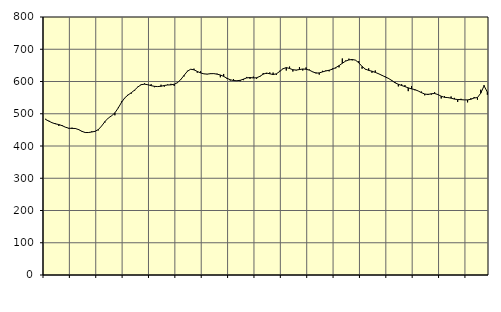
| Category | Piggar | Series 1 |
|---|---|---|
| nan | 484.3 | 482.21 |
| 87.0 | 478.1 | 477 |
| 87.0 | 471.3 | 471.91 |
| 87.0 | 470.2 | 468.63 |
| nan | 462.1 | 466.55 |
| 88.0 | 465.1 | 463.04 |
| 88.0 | 458 | 458.35 |
| 88.0 | 453.9 | 455.1 |
| nan | 456.8 | 454.6 |
| 89.0 | 455.7 | 454.3 |
| 89.0 | 452.7 | 450.87 |
| 89.0 | 444.4 | 445.42 |
| nan | 440.9 | 441.78 |
| 90.0 | 442.4 | 441.8 |
| 90.0 | 445.5 | 443.42 |
| 90.0 | 444.5 | 445.49 |
| nan | 448.5 | 451.05 |
| 91.0 | 462.4 | 462.18 |
| 91.0 | 473 | 475.91 |
| 91.0 | 486.8 | 486.66 |
| nan | 493.2 | 493.52 |
| 92.0 | 495.2 | 502.69 |
| 92.0 | 518.6 | 517.6 |
| 92.0 | 538 | 535.07 |
| nan | 548.4 | 549.22 |
| 93.0 | 559 | 558.13 |
| 93.0 | 562.6 | 565.29 |
| 93.0 | 571.8 | 573.62 |
| nan | 584.2 | 583.26 |
| 94.0 | 592 | 590.13 |
| 94.0 | 594.1 | 591.77 |
| 94.0 | 589.4 | 589.97 |
| nan | 591.7 | 587.15 |
| 95.0 | 582.3 | 585 |
| 95.0 | 584.1 | 584.28 |
| 95.0 | 590 | 585.3 |
| nan | 584.1 | 587.66 |
| 96.0 | 590.7 | 589.14 |
| 96.0 | 592.8 | 589.65 |
| 96.0 | 586.2 | 591.55 |
| nan | 597.4 | 596.36 |
| 97.0 | 605 | 606.16 |
| 97.0 | 615.8 | 619.02 |
| 97.0 | 633.2 | 631.64 |
| nan | 638.4 | 638.04 |
| 98.0 | 639.8 | 636.21 |
| 98.0 | 627.3 | 631.21 |
| 98.0 | 631.7 | 626.67 |
| nan | 623.3 | 623.71 |
| 99.0 | 622.2 | 622.95 |
| 99.0 | 625.4 | 624.21 |
| 99.0 | 623.8 | 624.46 |
| nan | 624.3 | 622.75 |
| 0.0 | 613.1 | 620.24 |
| 0.0 | 623.4 | 615.93 |
| 0.0 | 608.1 | 610.12 |
| nan | 603.1 | 605.36 |
| 1.0 | 607.3 | 603.04 |
| 1.0 | 601.8 | 602.38 |
| 1.0 | 600.8 | 603.6 |
| nan | 604.2 | 607.31 |
| 2.0 | 614.1 | 611.13 |
| 2.0 | 608.2 | 612.34 |
| 2.0 | 615.1 | 611.04 |
| nan | 608.4 | 611.57 |
| 3.0 | 614.5 | 616.06 |
| 3.0 | 626.3 | 622.74 |
| 3.0 | 623.5 | 626.14 |
| nan | 628.2 | 623.94 |
| 4.0 | 627.6 | 621.59 |
| 4.0 | 620.5 | 623.83 |
| 4.0 | 633.2 | 631.03 |
| nan | 640.3 | 639.47 |
| 5.0 | 634.1 | 643.1 |
| 5.0 | 646.3 | 640.41 |
| 5.0 | 631 | 636.49 |
| nan | 634.3 | 635.44 |
| 6.0 | 644.8 | 637.04 |
| 6.0 | 634.1 | 638.79 |
| 6.0 | 643.6 | 638.07 |
| nan | 637.1 | 635.23 |
| 7.0 | 629.3 | 630.08 |
| 7.0 | 628.1 | 625.97 |
| 7.0 | 621.3 | 626.61 |
| nan | 633.1 | 629.83 |
| 8.0 | 634.2 | 632.7 |
| 8.0 | 631.5 | 634.87 |
| 8.0 | 640.5 | 638.15 |
| nan | 640.7 | 642.96 |
| 9.0 | 643.8 | 649.15 |
| 9.0 | 671.4 | 656.53 |
| 9.0 | 664.8 | 663.24 |
| nan | 670.8 | 666.87 |
| 10.0 | 665.4 | 668.26 |
| 10.0 | 666.6 | 666.19 |
| 10.0 | 663.3 | 657.97 |
| nan | 639.7 | 646.7 |
| 11.0 | 637.2 | 638.36 |
| 11.0 | 640.8 | 634.42 |
| 11.0 | 626.9 | 631.9 |
| nan | 634.2 | 628.26 |
| 12.0 | 623.2 | 623.99 |
| 12.0 | 618.5 | 619.32 |
| 12.0 | 615.8 | 614.27 |
| nan | 610.9 | 609.64 |
| 13.0 | 601.7 | 603.2 |
| 13.0 | 598.6 | 596.06 |
| 13.0 | 584.8 | 591.28 |
| nan | 591.5 | 587.64 |
| 14.0 | 588.9 | 584.14 |
| 14.0 | 570.1 | 580.29 |
| 14.0 | 585.9 | 577.1 |
| nan | 572.8 | 574.86 |
| 15.0 | 570.7 | 570.72 |
| 15.0 | 568.7 | 565.41 |
| 15.0 | 557.1 | 561.2 |
| nan | 561.6 | 559.75 |
| 16.0 | 559.2 | 562.03 |
| 16.0 | 566.9 | 562.83 |
| 16.0 | 558.8 | 559.5 |
| nan | 547.3 | 554.38 |
| 17.0 | 554.4 | 550.95 |
| 17.0 | 549.2 | 550.13 |
| 17.0 | 553.5 | 548.38 |
| nan | 549.2 | 545.42 |
| 18.0 | 536.7 | 544.16 |
| 18.0 | 546.4 | 543.73 |
| 18.0 | 543 | 542.93 |
| nan | 535.3 | 542.94 |
| 19.0 | 548.2 | 544.91 |
| 19.0 | 551.9 | 548.88 |
| 19.0 | 543.4 | 550.21 |
| nan | 574.5 | 563.74 |
| 20.0 | 589.1 | 586.6 |
| 20.0 | 559 | 567.06 |